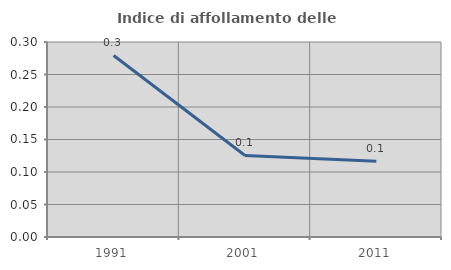
| Category | Indice di affollamento delle abitazioni  |
|---|---|
| 1991.0 | 0.279 |
| 2001.0 | 0.125 |
| 2011.0 | 0.116 |